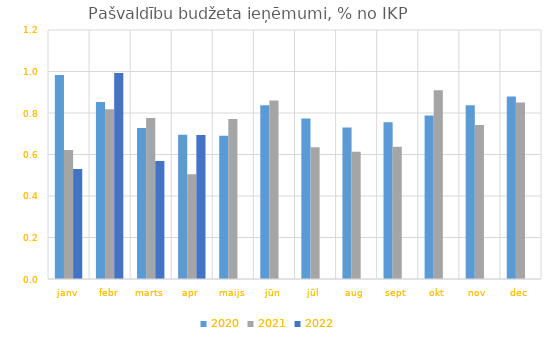
| Category | 2020 | 2021 | 2022 |
|---|---|---|---|
| janv | 0.983 | 0.621 | 0.53 |
| febr | 0.853 | 0.818 | 0.992 |
| marts | 0.727 | 0.776 | 0.568 |
| apr | 0.695 | 0.504 | 0.694 |
| maijs | 0.69 | 0.771 | 0 |
| jūn | 0.838 | 0.86 | 0 |
| jūl | 0.773 | 0.635 | 0 |
| aug | 0.73 | 0.613 | 0 |
| sept | 0.756 | 0.637 | 0 |
| okt | 0.788 | 0.91 | 0 |
| nov | 0.838 | 0.742 | 0 |
| dec | 0.88 | 0.85 | 0 |